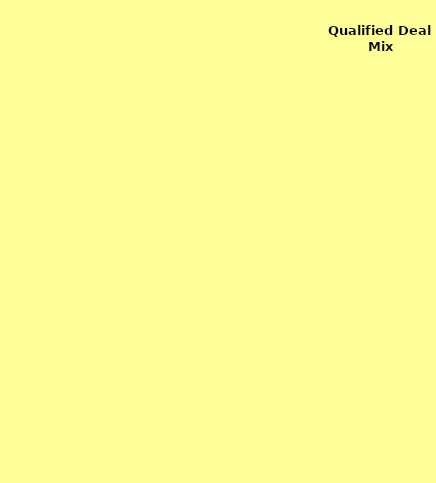
| Category | Focus Deal Mix |
|---|---|
| NewCar | 0 |
| NewTruck | 0 |
| UsedCar | 0 |
| UsedTruck | 0 |
| Misc | 0 |